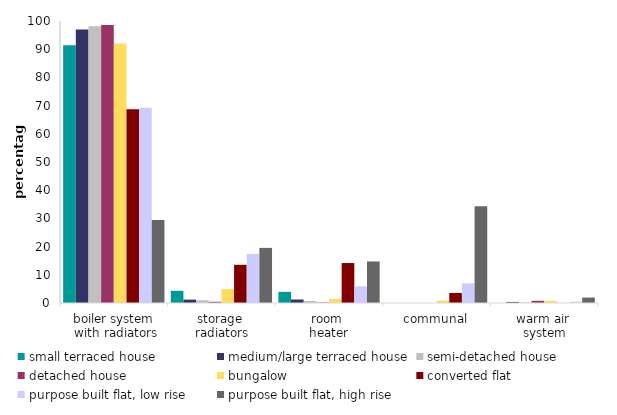
| Category | small terraced house | medium/large terraced house | semi-detached house | detached house | bungalow | converted flat | purpose built flat, low rise | purpose built flat, high rise |
|---|---|---|---|---|---|---|---|---|
| boiler system
 with radiators | 91.442 | 97.027 | 98.106 | 98.603 | 92.019 | 68.72 | 69.22 | 29.469 |
| storage 
radiators | 4.328 | 1.2 | 0.978 | 0.439 | 4.946 | 13.545 | 17.391 | 19.544 |
| room 
heater | 3.951 | 1.245 | 0.707 | 0.18 | 1.407 | 14.171 | 5.919 | 14.728 |
| communal | 0 | 0 | 0 | 0 | 0.87 | 3.563 | 6.951 | 34.328 |
| warm air 
system | 0 | 0.374 | 0.151 | 0.773 | 0.758 | 0 | 0.492 | 1.931 |